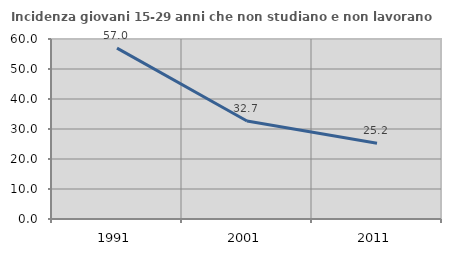
| Category | Incidenza giovani 15-29 anni che non studiano e non lavorano  |
|---|---|
| 1991.0 | 56.965 |
| 2001.0 | 32.677 |
| 2011.0 | 25.229 |